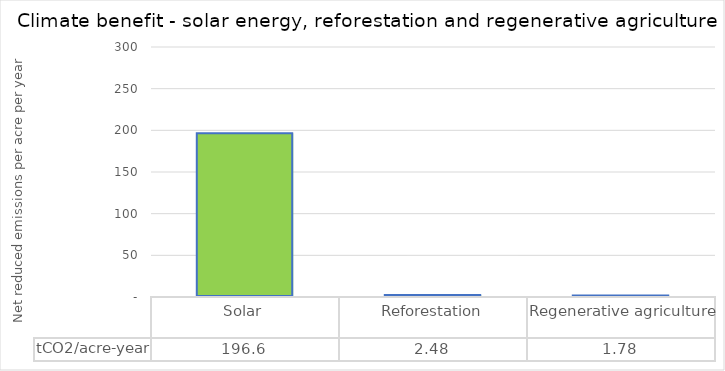
| Category | tCO2/acre-year |
|---|---|
| Solar | 196.589 |
| Reforestation | 2.484 |
| Regenerative agriculture | 1.78 |